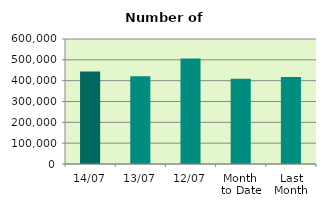
| Category | Series 0 |
|---|---|
| 14/07 | 444102 |
| 13/07 | 421658 |
| 12/07 | 506614 |
| Month 
to Date | 408759.4 |
| Last
Month | 418146.182 |